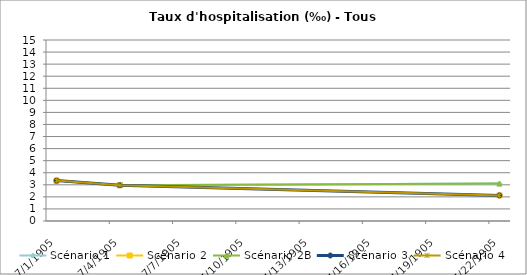
| Category | Scénario 1 | Scénario 2 | Scénario 2B | Scénario 3 | Scénario 4 |
|---|---|---|---|---|---|
| 2009.0 | 3.35 | 3.35 | 3.35 | 3.35 | 3.35 |
| 2012.0 | 2.971 | 2.971 | 2.971 | 2.971 | 2.971 |
| 2030.0 | 3.099 | 2.121 | 3.099 | 2.121 | 2.121 |